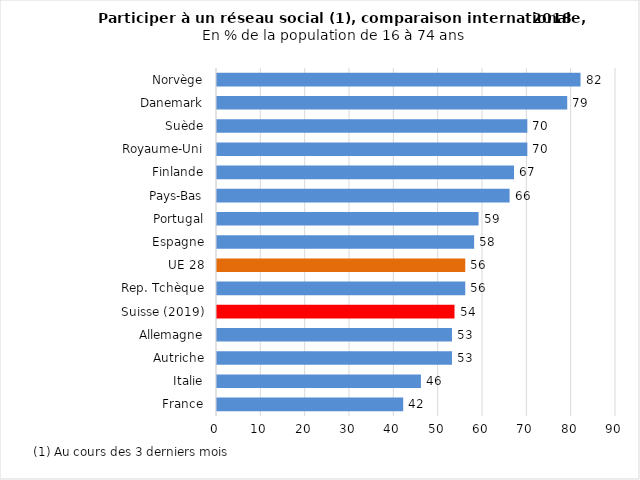
| Category | Series 0 |
|---|---|
| France | 42 |
| Italie | 46 |
| Autriche | 53 |
| Allemagne | 53 |
| Suisse (2019) | 53.573 |
| Rep. Tchèque | 56 |
| UE 28 | 56 |
| Espagne | 58 |
| Portugal | 59 |
| Pays-Bas | 66 |
| Finlande | 67 |
| Royaume-Uni | 70 |
| Suède | 70 |
| Danemark | 79 |
| Norvège | 82 |